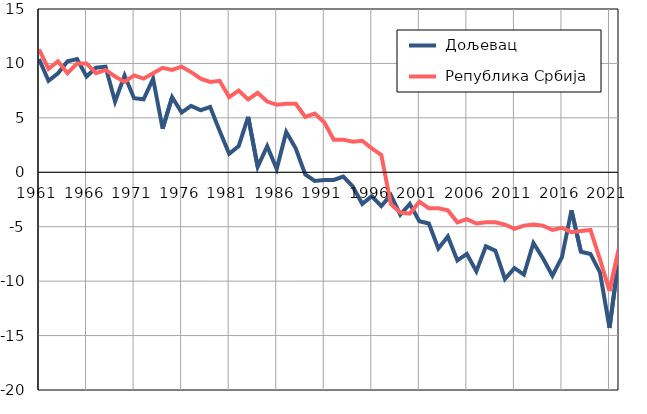
| Category |  Дољевац |  Република Србија |
|---|---|---|
| 1961.0 | 10.4 | 11.3 |
| 1962.0 | 8.4 | 9.5 |
| 1963.0 | 9.1 | 10.2 |
| 1964.0 | 10.2 | 9.1 |
| 1965.0 | 10.4 | 10 |
| 1966.0 | 8.8 | 10 |
| 1967.0 | 9.6 | 9.1 |
| 1968.0 | 9.7 | 9.4 |
| 1969.0 | 6.5 | 8.8 |
| 1970.0 | 8.9 | 8.3 |
| 1971.0 | 6.8 | 8.9 |
| 1972.0 | 6.7 | 8.6 |
| 1973.0 | 8.6 | 9.1 |
| 1974.0 | 4 | 9.6 |
| 1975.0 | 6.9 | 9.4 |
| 1976.0 | 5.5 | 9.7 |
| 1977.0 | 6.1 | 9.2 |
| 1978.0 | 5.7 | 8.6 |
| 1979.0 | 6 | 8.3 |
| 1980.0 | 3.8 | 8.4 |
| 1981.0 | 1.7 | 6.9 |
| 1982.0 | 2.4 | 7.5 |
| 1983.0 | 5.1 | 6.7 |
| 1984.0 | 0.5 | 7.3 |
| 1985.0 | 2.4 | 6.5 |
| 1986.0 | 0.3 | 6.2 |
| 1987.0 | 3.7 | 6.3 |
| 1988.0 | 2.2 | 6.3 |
| 1989.0 | -0.2 | 5.1 |
| 1990.0 | -0.8 | 5.4 |
| 1991.0 | -0.7 | 4.6 |
| 1992.0 | -0.7 | 3 |
| 1993.0 | -0.4 | 3 |
| 1994.0 | -1.3 | 2.8 |
| 1995.0 | -2.9 | 2.9 |
| 1996.0 | -2.2 | 2.2 |
| 1997.0 | -3.1 | 1.6 |
| 1998.0 | -2.1 | -2.9 |
| 1999.0 | -3.9 | -3.7 |
| 2000.0 | -2.9 | -3.8 |
| 2001.0 | -4.5 | -2.7 |
| 2002.0 | -4.7 | -3.3 |
| 2003.0 | -7 | -3.3 |
| 2004.0 | -5.9 | -3.5 |
| 2005.0 | -8.1 | -4.6 |
| 2006.0 | -7.5 | -4.3 |
| 2007.0 | -9.1 | -4.7 |
| 2008.0 | -6.8 | -4.6 |
| 2009.0 | -7.2 | -4.6 |
| 2010.0 | -9.8 | -4.8 |
| 2011.0 | -8.8 | -5.2 |
| 2012.0 | -9.4 | -4.9 |
| 2013.0 | -6.5 | -4.8 |
| 2014.0 | -7.9 | -4.9 |
| 2015.0 | -9.5 | -5.3 |
| 2016.0 | -7.8 | -5.1 |
| 2017.0 | -3.5 | -5.5 |
| 2018.0 | -7.3 | -5.4 |
| 2019.0 | -7.5 | -5.3 |
| 2020.0 | -9.2 | -8 |
| 2021.0 | -14.3 | -10.9 |
| 2022.0 | -7.7 | -7 |